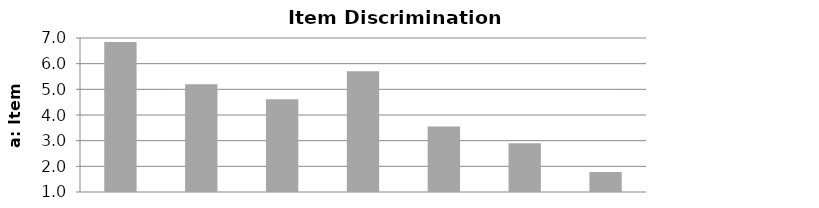
| Category | Series 0 |
|---|---|
| 1.0 | 6.846 |
| 2.0 | 5.2 |
| 3.0 | 4.613 |
| 4.0 | 5.701 |
| 5.0 | 3.556 |
| 6.0 | 2.897 |
| 7.0 | 1.778 |